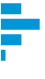
| Category | Series 0 |
|---|---|
| 0 | 0.241 |
| 1 | 0.471 |
| 2 | 0.243 |
| 3 | 0.044 |